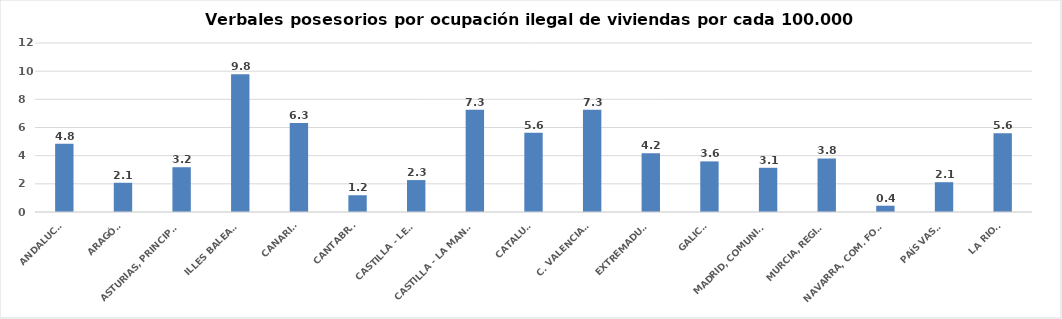
| Category | Series 0 |
|---|---|
| ANDALUCÍA | 4.848 |
| ARAGÓN | 2.075 |
| ASTURIAS, PRINCIPADO | 3.179 |
| ILLES BALEARS | 9.779 |
| CANARIAS | 6.327 |
| CANTABRIA | 1.189 |
| CASTILLA - LEÓN | 2.266 |
| CASTILLA - LA MANCHA | 7.257 |
| CATALUÑA | 5.634 |
| C. VALENCIANA | 7.263 |
| EXTREMADURA | 4.173 |
| GALICIA | 3.593 |
| MADRID, COMUNIDAD | 3.139 |
| MURCIA, REGIÓN | 3.8 |
| NAVARRA, COM. FORAL | 0.446 |
| PAÍS VASCO | 2.117 |
| LA RIOJA | 5.586 |